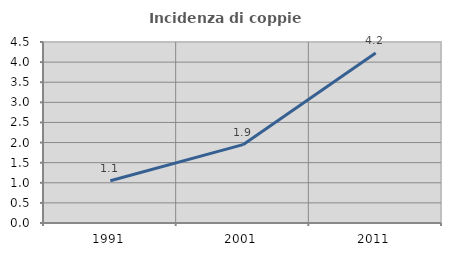
| Category | Incidenza di coppie miste |
|---|---|
| 1991.0 | 1.05 |
| 2001.0 | 1.948 |
| 2011.0 | 4.226 |